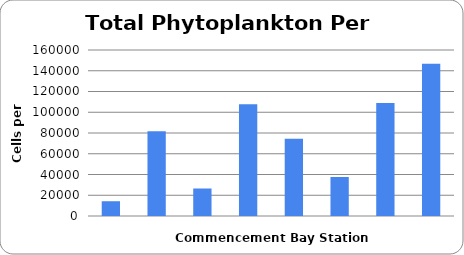
| Category | Count |
|---|---|
| Station 1 | 14230 |
| Station 2 | 81746 |
| Station 3 | 26509 |
| Station 4 | 107627 |
| Station 5 | 74418 |
| Station 6 | 37593 |
| Station 7 | 108849 |
| Station 8 | 146774 |